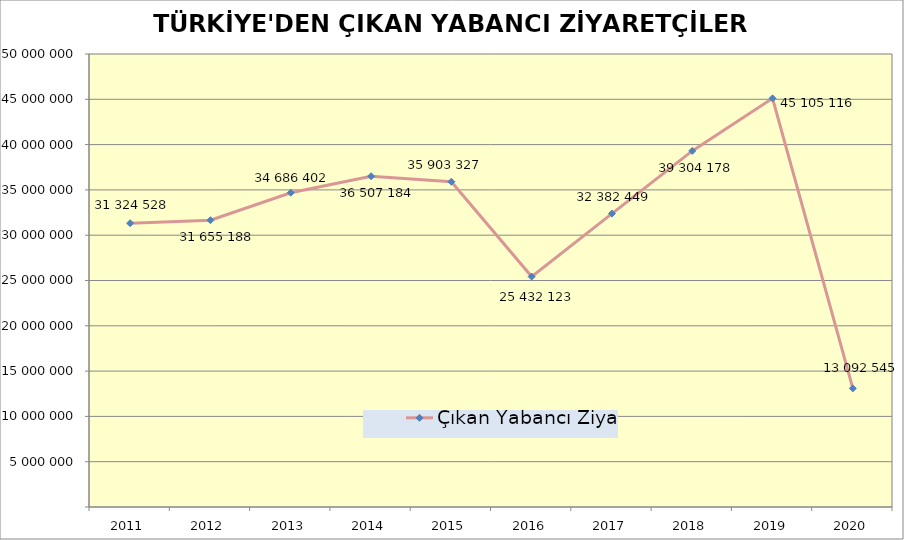
| Category | Çıkan Yabancı Ziyaretçi |
|---|---|
| 2011.0 | 31324528 |
| 2012.0 | 31655188 |
| 2013.0 | 34686402 |
| 2014.0 | 36507184 |
| 2015.0 | 35903327 |
| 2016.0 | 25432123 |
| 2017.0 | 32382449 |
| 2018.0 | 39304178 |
| 2019.0 | 45105116 |
| 2020.0 | 13092545 |